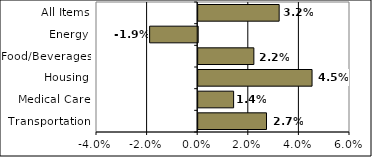
| Category | Series 0 |
|---|---|
| Transportation | 0.027 |
| Medical Care | 0.014 |
| Housing | 0.045 |
| Food/Beverages | 0.022 |
| Energy | -0.019 |
| All Items | 0.032 |